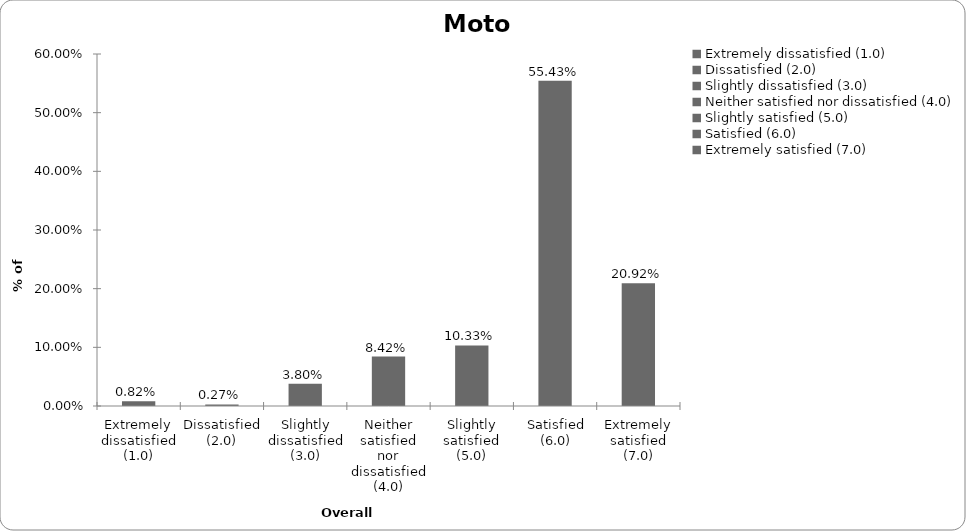
| Category | Motor |
|---|---|
| Extremely dissatisfied (1.0) | 0.008 |
| Dissatisfied (2.0) | 0.003 |
| Slightly dissatisfied (3.0) | 0.038 |
| Neither satisfied nor dissatisfied (4.0) | 0.084 |
| Slightly satisfied (5.0) | 0.103 |
| Satisfied (6.0) | 0.554 |
| Extremely satisfied (7.0) | 0.209 |